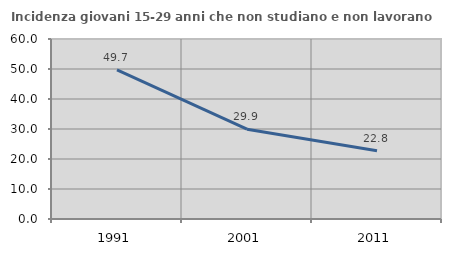
| Category | Incidenza giovani 15-29 anni che non studiano e non lavorano  |
|---|---|
| 1991.0 | 49.729 |
| 2001.0 | 29.946 |
| 2011.0 | 22.754 |